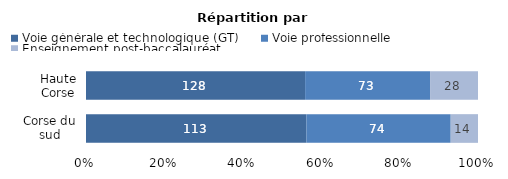
| Category | Voie générale et technologique (GT) | Voie professionnelle | Enseignement post-baccalauréat |
|---|---|---|---|
| Corse du sud | 113 | 74 | 14 |
| Haute Corse | 128 | 73 | 28 |